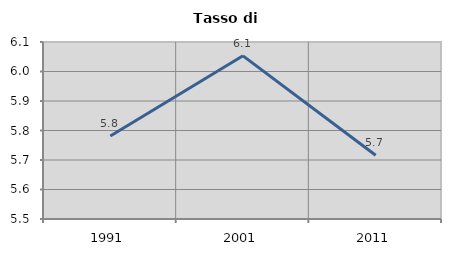
| Category | Tasso di disoccupazione   |
|---|---|
| 1991.0 | 5.781 |
| 2001.0 | 6.053 |
| 2011.0 | 5.716 |